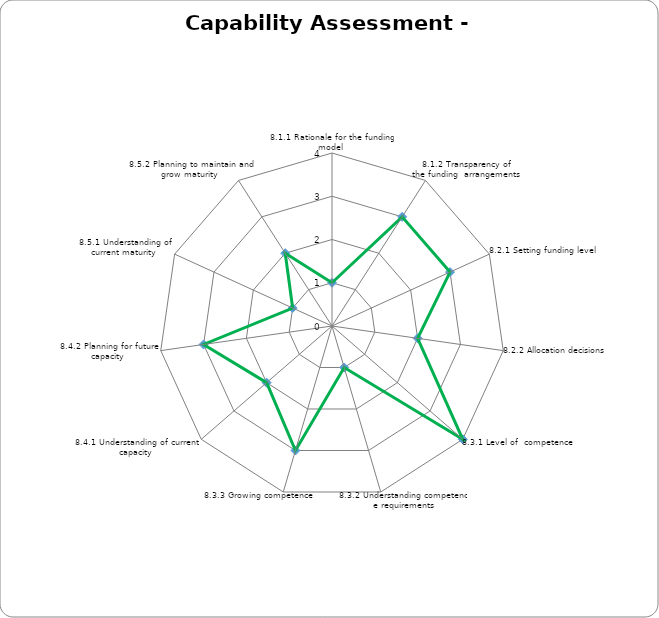
| Category | Series 0 |
|---|---|
| 8.1.1 Rationale for the funding model  | 1 |
| 8.1.2 Transparency of the funding  arrangements | 3 |
| 8.2.1 Setting funding level | 3 |
| 8.2.2 Allocation decisions  | 2 |
| 8.3.1 Level of  competence  | 4 |
| 8.3.2 Understanding competence requirements | 1 |
| 8.3.3 Growing competence  | 3 |
| 8.4.1 Understanding of current capacity  | 2 |
| 8.4.2 Planning for future capacity  | 3 |
| 8.5.1 Understanding of current maturity  | 1 |
| 8.5.2 Planning to maintain and grow maturity  | 2 |